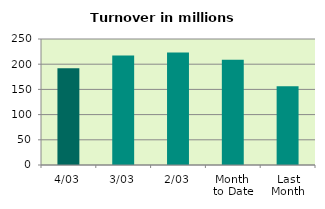
| Category | Series 0 |
|---|---|
| 4/03 | 191.922 |
| 3/03 | 217.176 |
| 2/03 | 223.15 |
| Month 
to Date | 209.007 |
| Last
Month | 156.222 |